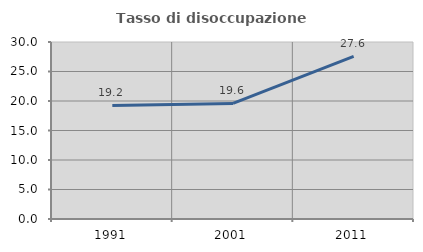
| Category | Tasso di disoccupazione giovanile  |
|---|---|
| 1991.0 | 19.241 |
| 2001.0 | 19.583 |
| 2011.0 | 27.551 |